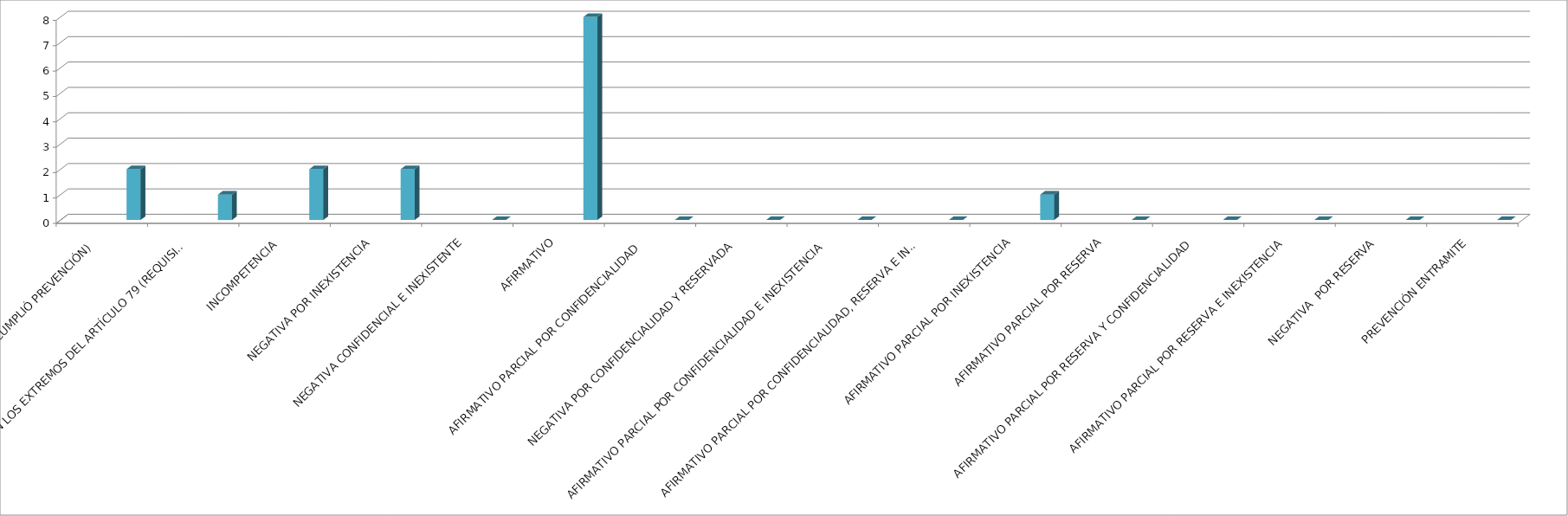
| Category | Series 0 | Series 1 | Series 2 | Series 3 | Series 4 |
|---|---|---|---|---|---|
| SE TIENE POR NO PRESENTADA ( NO CUMPLIÓ PREVENCIÓN) |  |  |  |  | 2 |
| NO CUMPLIO CON LOS EXTREMOS DEL ARTÍCULO 79 (REQUISITOS) |  |  |  |  | 1 |
| INCOMPETENCIA  |  |  |  |  | 2 |
| NEGATIVA POR INEXISTENCIA |  |  |  |  | 2 |
| NEGATIVA CONFIDENCIAL E INEXISTENTE |  |  |  |  | 0 |
| AFIRMATIVO |  |  |  |  | 8 |
| AFIRMATIVO PARCIAL POR CONFIDENCIALIDAD  |  |  |  |  | 0 |
| NEGATIVA POR CONFIDENCIALIDAD Y RESERVADA |  |  |  |  | 0 |
| AFIRMATIVO PARCIAL POR CONFIDENCIALIDAD E INEXISTENCIA |  |  |  |  | 0 |
| AFIRMATIVO PARCIAL POR CONFIDENCIALIDAD, RESERVA E INEXISTENCIA |  |  |  |  | 0 |
| AFIRMATIVO PARCIAL POR INEXISTENCIA |  |  |  |  | 1 |
| AFIRMATIVO PARCIAL POR RESERVA |  |  |  |  | 0 |
| AFIRMATIVO PARCIAL POR RESERVA Y CONFIDENCIALIDAD |  |  |  |  | 0 |
| AFIRMATIVO PARCIAL POR RESERVA E INEXISTENCIA |  |  |  |  | 0 |
| NEGATIVA  POR RESERVA |  |  |  |  | 0 |
| PREVENCIÓN ENTRAMITE |  |  |  |  | 0 |